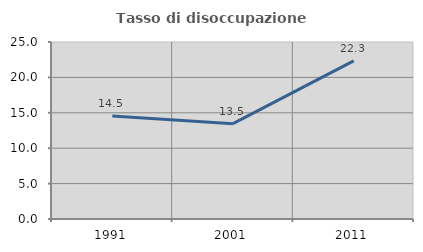
| Category | Tasso di disoccupazione giovanile  |
|---|---|
| 1991.0 | 14.54 |
| 2001.0 | 13.467 |
| 2011.0 | 22.344 |